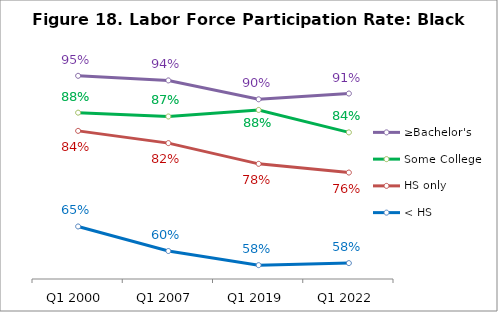
| Category | ≥Bachelor's | Some College | HS only | < HS |
|---|---|---|---|---|
| Q1 2000 | 0.948 | 0.875 | 0.84 | 0.653 |
| Q1 2007 | 0.939 | 0.868 | 0.816 | 0.605 |
| Q1 2019 | 0.902 | 0.881 | 0.775 | 0.577 |
| Q1 2022 | 0.913 | 0.837 | 0.758 | 0.581 |